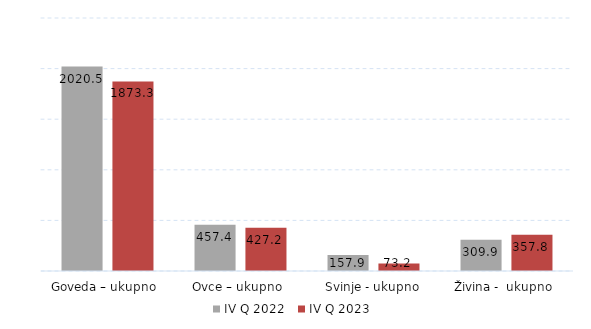
| Category | IV Q 2022 | IV Q 2023 |
|---|---|---|
| Goveda – ukupno  | 2020.5 | 1873.3 |
| Ovce – ukupno  | 457.4 | 427.2 |
| Svinje - ukupno | 157.9 | 73.2 |
| Živina -  ukupno  | 309.9 | 357.8 |